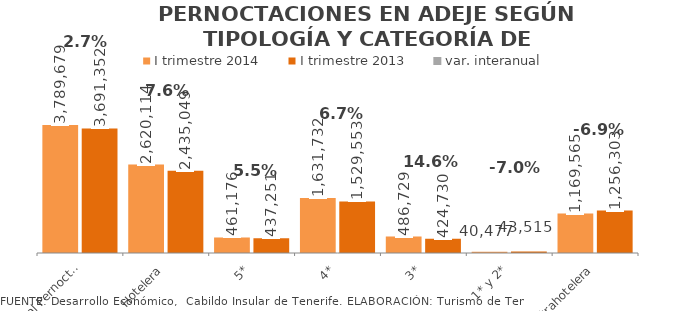
| Category | I trimestre 2014 | I trimestre 2013 |
|---|---|---|
| Total Pernoctaciones | 3789679 | 3691352 |
| Hotelera | 2620114 | 2435049 |
| 5* | 461176 | 437251 |
| 4* | 1631732 | 1529553 |
| 3* | 486729 | 424730 |
| 1* y 2* | 40477 | 43515 |
| Extrahotelera | 1169565 | 1256303 |